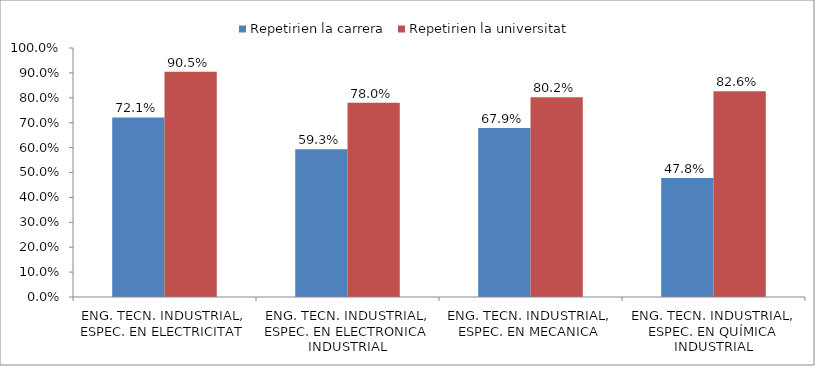
| Category | Repetirien la carrera | Repetirien la universitat |
|---|---|---|
| ENG. TECN. INDUSTRIAL, ESPEC. EN ELECTRICITAT | 0.721 | 0.905 |
| ENG. TECN. INDUSTRIAL, ESPEC. EN ELECTRONICA INDUSTRIAL | 0.593 | 0.78 |
| ENG. TECN. INDUSTRIAL, ESPEC. EN MECANICA | 0.679 | 0.802 |
| ENG. TECN. INDUSTRIAL, ESPEC. EN QUÍMICA INDUSTRIAL | 0.478 | 0.826 |